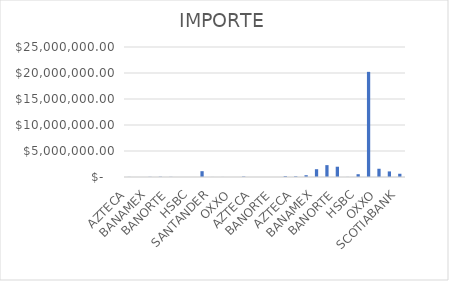
| Category | IMPORTE |
|---|---|
| AZTECA | 17747.56 |
| BAJIO | 3249.56 |
| BANAMEX | 33879.84 |
| BANCOMER | 53927.77 |
| BANORTE | 27628.5 |
| BANREGIO | 552.03 |
| HSBC | 2619.66 |
| INTERNET | 1118697.22 |
| SANTANDER | 7234.93 |
| SCOTIABANK | 9134.29 |
| OXXO | 236 |
| ESTAC.BANORTE | 90772.5 |
| AZTECA | 298 |
| BAJIO | 298 |
| BANORTE | 1491.6 |
| INTERNET | 163992.2 |
| AZTECA | 128532.36 |
| BAJIO | 342348.42 |
| BANAMEX | 1498676.56 |
| BANCOMER | 2282655 |
| BANORTE | 1977832.34 |
| BANREGIO | 15445.38 |
| HSBC | 536639.63 |
| INTERNET | 20219955.65 |
| OXXO | 1586339.78 |
| SANTANDER | 1074275.16 |
| SCOTIABANK | 623239.34 |